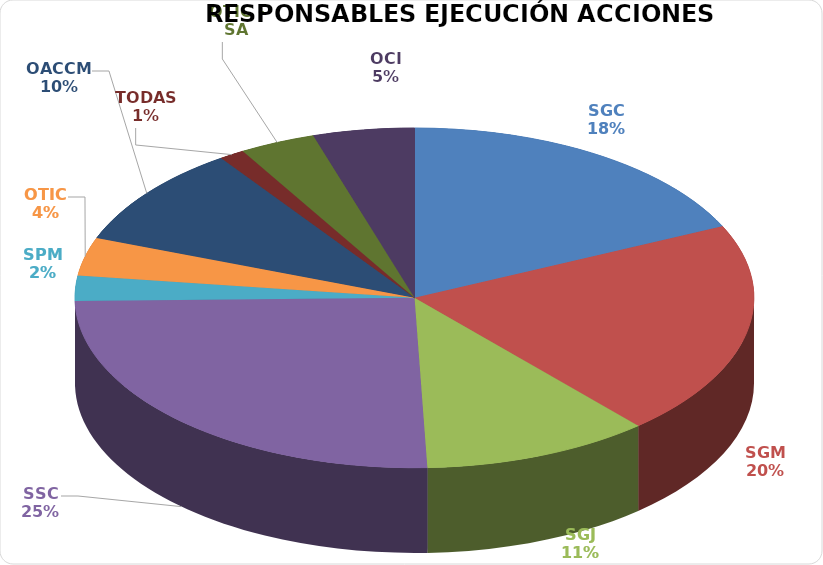
| Category | Series 0 |
|---|---|
| SGC | 15 |
| SGM | 17 |
| SGJ | 9 |
| SSC | 21 |
| SPM | 2 |
| OTIC | 3 |
| OACCM | 8 |
| TODAS | 1 |
| OTIC - SA | 3 |
| OCI | 4 |